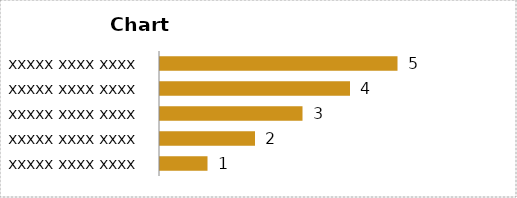
| Category | Series 0 |
|---|---|
| xxxxx xxxx xxxx | 1 |
| xxxxx xxxx xxxx | 2 |
| xxxxx xxxx xxxx | 3 |
| xxxxx xxxx xxxx | 4 |
| xxxxx xxxx xxxx | 5 |